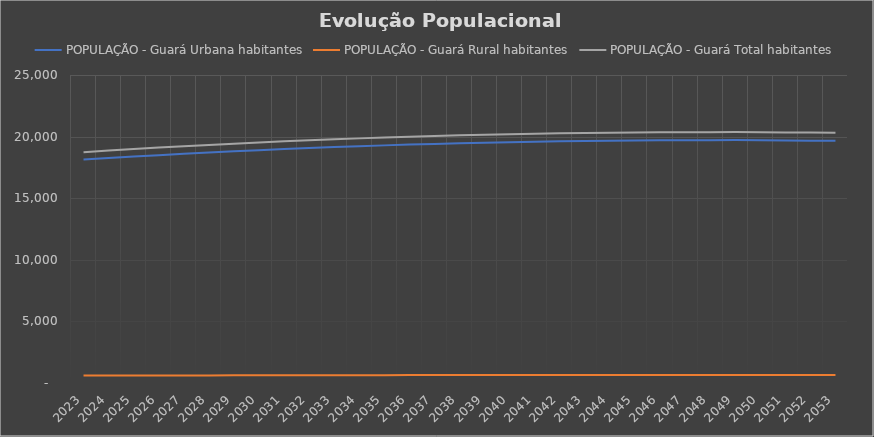
| Category | POPULAÇÃO - Guará |
|---|---|
| 2023.0 | 18738.103 |
| 2024.0 | 18865.522 |
| 2025.0 | 18988.148 |
| 2026.0 | 19105.874 |
| 2027.0 | 19218.599 |
| 2028.0 | 19326.223 |
| 2029.0 | 19426.719 |
| 2030.0 | 19523.853 |
| 2031.0 | 19613.663 |
| 2032.0 | 19699.963 |
| 2033.0 | 19780.733 |
| 2034.0 | 19855.899 |
| 2035.0 | 19925.395 |
| 2036.0 | 19989.156 |
| 2037.0 | 20049.124 |
| 2038.0 | 20103.256 |
| 2039.0 | 20151.504 |
| 2040.0 | 20195.837 |
| 2041.0 | 20234.21 |
| 2042.0 | 20266.584 |
| 2043.0 | 20294.958 |
| 2044.0 | 20317.282 |
| 2045.0 | 20335.568 |
| 2046.0 | 20347.769 |
| 2047.0 | 20355.908 |
| 2048.0 | 20359.979 |
| 2049.0 | 20366.087 |
| 2050.0 | 20351.831 |
| 2051.0 | 20339.62 |
| 2052.0 | 20323.348 |
| 2053.0 | 20303.025 |